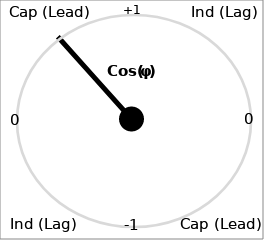
| Category | Series 0 |
|---|---|
| 0.0 | 0 |
| -0.6217401170090344 | 0.783 |